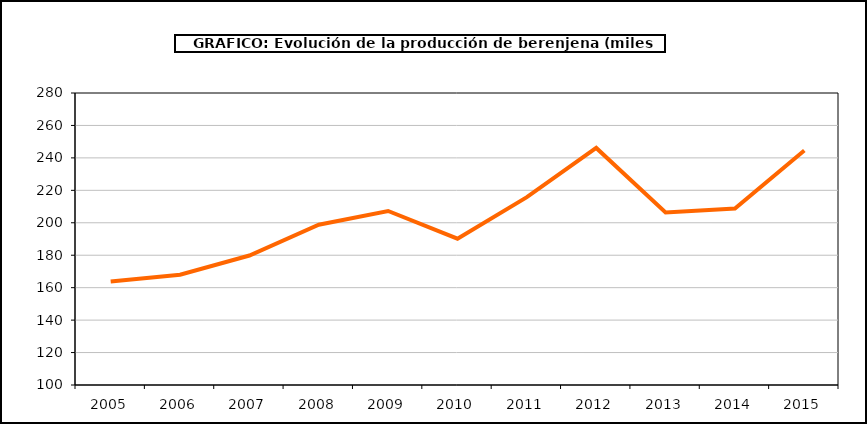
| Category | producción |
|---|---|
| 2005.0 | 163.783 |
| 2006.0 | 167.991 |
| 2007.0 | 179.826 |
| 2008.0 | 198.768 |
| 2009.0 | 207.269 |
| 2010.0 | 190.195 |
| 2011.0 | 215.769 |
| 2012.0 | 246.142 |
| 2013.0 | 206.333 |
| 2014.0 | 208.821 |
| 2015.0 | 244.54 |